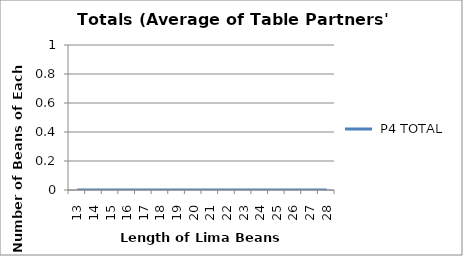
| Category |  P4 TOTAL |
|---|---|
| 13.0 | 0 |
| 14.0 | 0 |
| 15.0 | 0 |
| 16.0 | 0 |
| 17.0 | 0 |
| 18.0 | 0 |
| 19.0 | 0 |
| 20.0 | 0 |
| 21.0 | 0 |
| 22.0 | 0 |
| 23.0 | 0 |
| 24.0 | 0 |
| 25.0 | 0 |
| 26.0 | 0 |
| 27.0 | 0 |
| 28.0 | 0 |